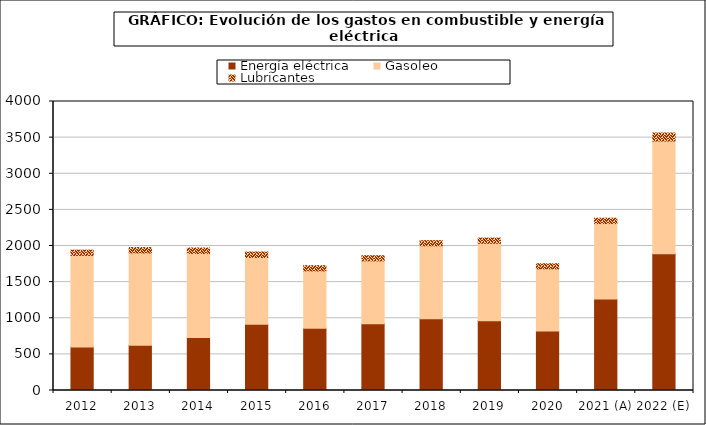
| Category | Energía eléctrica | Gasoleo | Lubricantes |
|---|---|---|---|
| 2012 | 602.887 | 1266.655 | 72.753 |
| 2013 | 628.022 | 1275.795 | 74.642 |
| 2014 | 733.314 | 1163.411 | 75.37 |
| 2015 | 915.498 | 926.353 | 75.218 |
| 2016 | 861.816 | 793.633 | 72.641 |
| 2017 | 922.733 | 871.301 | 70.822 |
| 2018 | 993.507 | 1009.663 | 70.844 |
| 2019 | 965.958 | 1071.529 | 71.16 |
| 2020 | 824.258 | 859.494 | 70.661 |
| 2021 (A) | 1267.484 | 1042.824 | 74.753 |
| 2022 (E) | 1894.038 | 1558.323 | 111.706 |